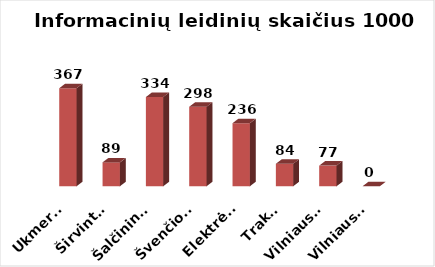
| Category | Series 0 |
|---|---|
| Ukmergė | 367.27 |
| Širvintos | 89.403 |
| Šalčininkai | 334.214 |
| Švenčionys | 297.826 |
| Elektrėnai | 236.312 |
| Trakai | 84.274 |
| Vilniaus r. | 77.339 |
| Vilniaus m. | 0 |